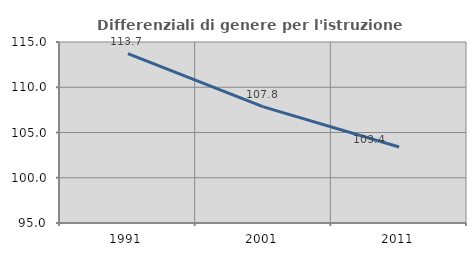
| Category | Differenziali di genere per l'istruzione superiore |
|---|---|
| 1991.0 | 113.715 |
| 2001.0 | 107.836 |
| 2011.0 | 103.403 |